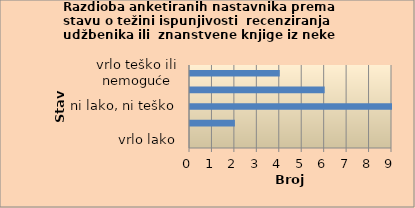
| Category | Series 0 |
|---|---|
| vrlo lako | 0 |
| lako | 2 |
| ni lako, ni teško | 9 |
| teško | 6 |
| vrlo teško ili nemoguće | 4 |